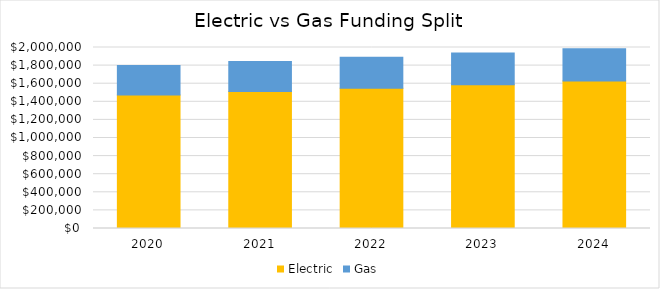
| Category | Electric | Gas |
|---|---|---|
| 2020.0 | 1476000 | 324000 |
| 2021.0 | 1512900 | 332100 |
| 2022.0 | 1550700 | 340400 |
| 2023.0 | 1589500 | 348900 |
| 2024.0 | 1629200 | 357600 |